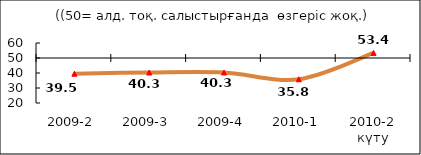
| Category | Диф.индекс ↓ |
|---|---|
| 2009-2 | 39.51 |
| 2009-3 | 40.34 |
| 2009-4 | 40.345 |
| 2010-1 | 35.815 |
| 2010-2 күту | 53.37 |